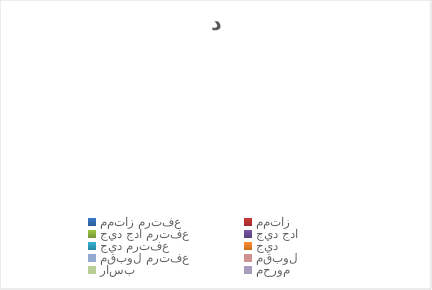
| Category | العدد |
|---|---|
| ممتاز مرتفع | 0 |
| ممتاز  | 0 |
| جيد جدا مرتفع | 0 |
| جيد جدا | 0 |
| جيد مرتفع | 0 |
| جيد | 0 |
| مقبول مرتفع | 0 |
| مقبول | 0 |
| راسب | 0 |
| محروم | 0 |